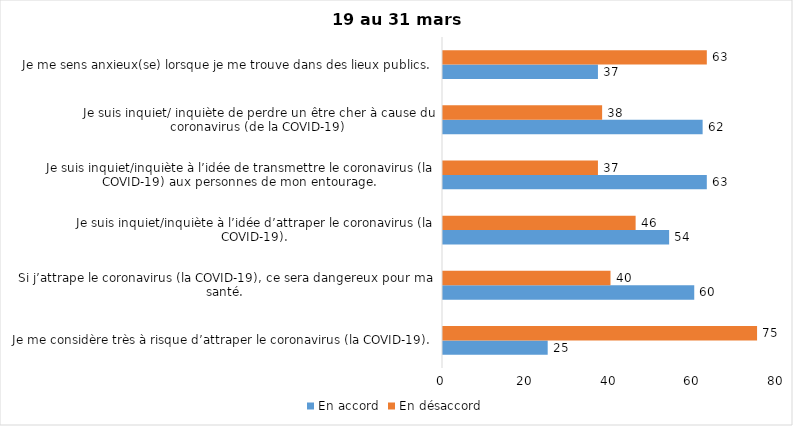
| Category | En accord | En désaccord |
|---|---|---|
| Je me considère très à risque d’attraper le coronavirus (la COVID-19). | 25 | 75 |
| Si j’attrape le coronavirus (la COVID-19), ce sera dangereux pour ma santé. | 60 | 40 |
| Je suis inquiet/inquiète à l’idée d’attraper le coronavirus (la COVID-19). | 54 | 46 |
| Je suis inquiet/inquiète à l’idée de transmettre le coronavirus (la COVID-19) aux personnes de mon entourage. | 63 | 37 |
| Je suis inquiet/ inquiète de perdre un être cher à cause du coronavirus (de la COVID-19) | 62 | 38 |
| Je me sens anxieux(se) lorsque je me trouve dans des lieux publics. | 37 | 63 |